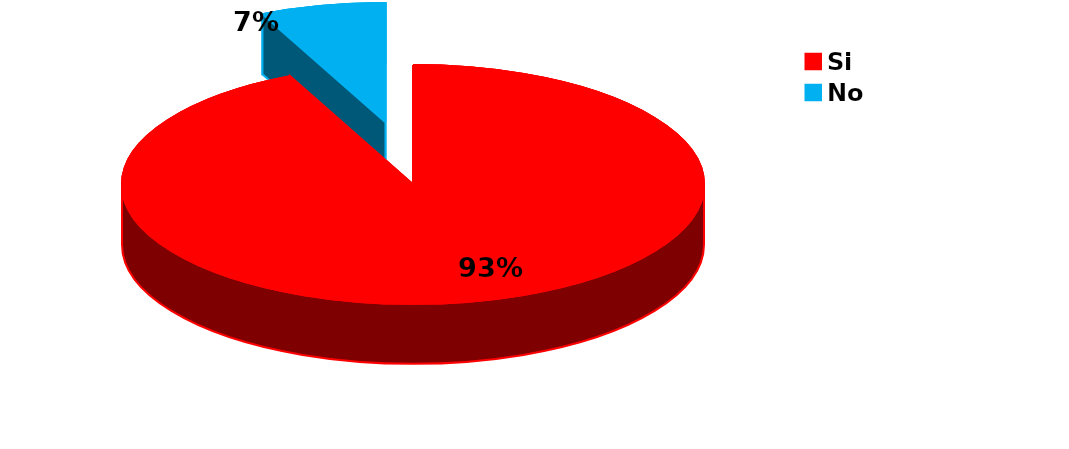
| Category | Series 0 |
|---|---|
| Si | 67 |
| No | 5 |